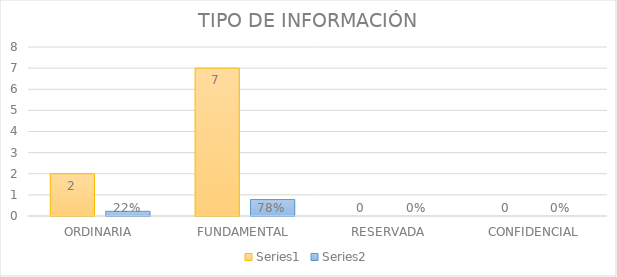
| Category | Series 3 | Series 4 |
|---|---|---|
| ORDINARIA | 2 | 0.222 |
| FUNDAMENTAL | 7 | 0.778 |
| RESERVADA | 0 | 0 |
| CONFIDENCIAL | 0 | 0 |